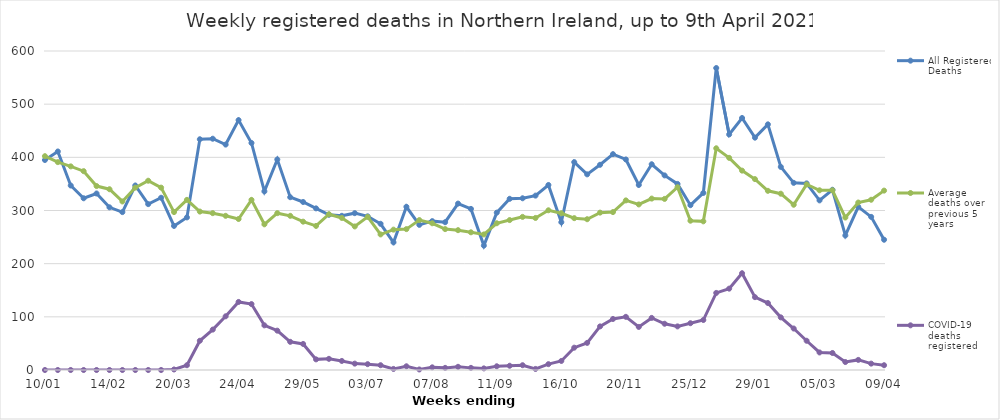
| Category | All Registered Deaths | Average deaths over previous 5 years | COVID-19 deaths registered |
|---|---|---|---|
| 2020-01-10 | 395 | 402.2 | 0 |
| 2020-01-17 | 411 | 391 | 0 |
| 2020-01-24 | 347 | 383 | 0 |
| 2020-01-31 | 323 | 374 | 0 |
| 2020-02-07 | 332 | 346 | 0 |
| 2020-02-14 | 306 | 340 | 0 |
| 2020-02-21 | 297 | 317 | 0 |
| 2020-02-28 | 347 | 343 | 0 |
| 2020-03-06 | 312 | 356 | 0 |
| 2020-03-13 | 324 | 343 | 0 |
| 2020-03-20 | 271 | 297 | 1 |
| 2020-03-27 | 287 | 320 | 9 |
| 2020-04-03 | 434 | 298 | 55 |
| 2020-04-10 | 435 | 295 | 76 |
| 2020-04-17 | 424 | 290 | 101 |
| 2020-04-24 | 470 | 284 | 128 |
| 2020-05-01 | 427 | 320 | 124 |
| 2020-05-08 | 336 | 274 | 84 |
| 2020-05-15 | 396 | 295 | 74 |
| 2020-05-22 | 325 | 290 | 53 |
| 2020-05-29 | 316 | 279 | 49 |
| 2020-06-05 | 304 | 271 | 20 |
| 2020-06-12 | 292 | 293 | 21 |
| 2020-06-19 | 290 | 286 | 17 |
| 2020-06-26 | 295 | 270 | 12 |
| 2020-07-03 | 289 | 288 | 11 |
| 2020-07-10 | 275 | 255 | 9 |
| 2020-07-17 | 240 | 264 | 2 |
| 2020-07-24 | 307 | 265 | 7 |
| 2020-07-31 | 273 | 282 | 1 |
| 2020-08-07 | 280 | 276 | 5 |
| 2020-08-14 | 278 | 265 | 4 |
| 2020-08-21 | 313 | 263 | 6 |
| 2020-08-28 | 303 | 259 | 4 |
| 2020-09-04 | 234 | 255 | 3 |
| 2020-09-11 | 296 | 276 | 7 |
| 2020-09-18 | 322 | 282 | 8 |
| 2020-09-25 | 323 | 288 | 9 |
| 2020-10-02 | 328 | 286 | 2 |
| 2020-10-09 | 348 | 300.4 | 11 |
| 2020-10-16 | 278 | 294.8 | 17 |
| 2020-10-23 | 391 | 285.6 | 42 |
| 2020-10-30 | 368 | 283.6 | 51 |
| 2020-11-06 | 386 | 296 | 82 |
| 2020-11-13 | 406 | 297 | 96 |
| 2020-11-20 | 396 | 319 | 100 |
| 2020-11-27 | 348 | 311.4 | 81 |
| 2020-12-04 | 387 | 322.4 | 98 |
| 2020-12-11 | 366 | 321.8 | 87 |
| 2020-12-18 | 350 | 343.8 | 82 |
| 2020-12-25 | 310 | 280.8 | 88 |
| 2021-01-01 | 333 | 279.6 | 94 |
| 2021-01-08 | 568 | 417 | 145 |
| 2021-01-15 | 443 | 399 | 153 |
| 2021-01-22 | 474 | 375 | 182 |
| 2021-01-29 | 437 | 359 | 137 |
| 2021-02-05 | 462 | 337 | 126 |
| 2021-02-12 | 382 | 331.6 | 99 |
| 2021-02-19 | 352 | 310.8 | 78 |
| 2021-02-26 | 351 | 349 | 55 |
| 2021-03-05 | 319 | 338 | 33 |
| 2021-03-12 | 339 | 338 | 32 |
| 2021-03-19 | 253 | 286.8 | 15 |
| 2021-03-26 | 307 | 315 | 19 |
| 2021-04-02 | 288 | 320.2 | 12 |
| 2021-04-09 | 245 | 337.4 | 9 |